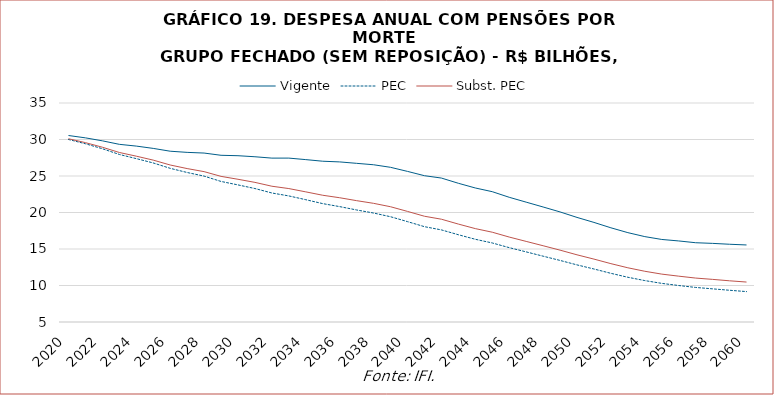
| Category | Vigente | PEC | Subst. PEC |
|---|---|---|---|
| 2020.0 | 30547572837.315 | 30004353413.906 | 30106649805.861 |
| 2021.0 | 30225752271.362 | 29416341692.708 | 29570115856.598 |
| 2022.0 | 29816330828.015 | 28733455284.808 | 28941991418.873 |
| 2023.0 | 29338147086.728 | 27952182558.817 | 28221586900.565 |
| 2024.0 | 29098086036.513 | 27382052045.075 | 27716472473.272 |
| 2025.0 | 28781355420.293 | 26787283152.415 | 27176490516.962 |
| 2026.0 | 28395579715.234 | 26051103021.569 | 26508269819.332 |
| 2027.0 | 28237940022.89 | 25479803725.46 | 26017040300.581 |
| 2028.0 | 28143837904.493 | 24984187492.275 | 25599308246.474 |
| 2029.0 | 27836783527.362 | 24253536880.571 | 24948833025.476 |
| 2030.0 | 27779597371.313 | 23780329226.343 | 24552615433.109 |
| 2031.0 | 27635514961.476 | 23283386705.713 | 24125480242.367 |
| 2032.0 | 27448972214.1 | 22672269291.087 | 23599505757.203 |
| 2033.0 | 27451925064.722 | 22270183975.24 | 23278948593.381 |
| 2034.0 | 27243352240.041 | 21753451403.349 | 22825810234.808 |
| 2035.0 | 27023493147.021 | 21216386953.807 | 22361722929.61 |
| 2036.0 | 26929047962.848 | 20805345190.258 | 22022179379.192 |
| 2037.0 | 26734888859.554 | 20346281246.65 | 21621632147.694 |
| 2038.0 | 26538989389.748 | 19927915088.64 | 21255386916.629 |
| 2039.0 | 26189063684.682 | 19420363762.926 | 20788349843.869 |
| 2040.0 | 25630323827.57 | 18749892076.929 | 20148113956.889 |
| 2041.0 | 25042133929.519 | 18058933211.223 | 19487960848.848 |
| 2042.0 | 24717913529.085 | 17617545975.609 | 19080870158.994 |
| 2043.0 | 24002775818.68 | 16954740073.026 | 18414432268.53 |
| 2044.0 | 23358338626.898 | 16331489933.638 | 17795169191.184 |
| 2045.0 | 22851125716.566 | 15827339022.205 | 17299372436.998 |
| 2046.0 | 22084277236.467 | 15186992994.591 | 16637290360.665 |
| 2047.0 | 21417012305.262 | 14606297124.727 | 16041884263.156 |
| 2048.0 | 20753819994.346 | 14017487964.043 | 15445371120.915 |
| 2049.0 | 20077383029.908 | 13434039533.709 | 14842647074.052 |
| 2050.0 | 19326441961.111 | 12822337889.934 | 14202454815.461 |
| 2051.0 | 18642257515.009 | 12259661340.863 | 13616852156.856 |
| 2052.0 | 17903517973.505 | 11667201141.396 | 12993614723.747 |
| 2053.0 | 17239599213.474 | 11127693359.542 | 12426765592.678 |
| 2054.0 | 16696055328.843 | 10672205773.352 | 11949134440.329 |
| 2055.0 | 16307769389.744 | 10291384398.283 | 11559082624.871 |
| 2056.0 | 16103689777.243 | 9996853201.15 | 11279406689.041 |
| 2057.0 | 15860273492.418 | 9733451048.214 | 11017143876.673 |
| 2058.0 | 15769957858.574 | 9541230849.44 | 10837639060.272 |
| 2059.0 | 15650645811.078 | 9346575444.454 | 10643836664.663 |
| 2060.0 | 15554193270.373 | 9165812366.163 | 10472733135.779 |